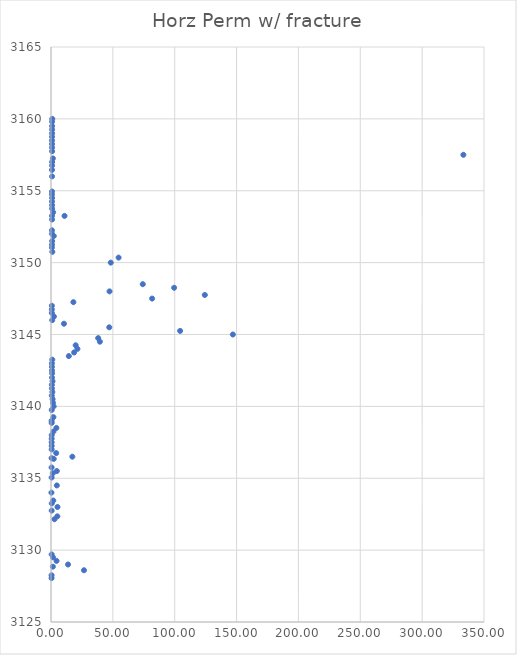
| Category | Horz Perm w/ fracture |
|---|---|
| 0.4616666666666666 | 3128.05 |
| 0.4563333333333333 | 3128.25 |
| 26.666666666666668 | 3128.6 |
| 1.5133333333333334 | 3128.85 |
| 13.766666666666666 | 3129 |
| 4.466666666666666 | 3129.25 |
| 1.62 | 3129.5 |
| 0.5323333333333333 | 3129.7 |
| 2.8000000000000003 | 3132.15 |
| 5.133333333333334 | 3132.35 |
| 0.5486666666666666 | 3132.75 |
| 5.243333333333333 | 3133 |
| 0.6086666666666667 | 3133.25 |
| 1.86 | 3133.45 |
| 0.35333333333333333 | 3134 |
| 4.706666666666667 | 3134.5 |
| 0.5143333333333334 | 3135.05 |
| 1.4633333333333332 | 3135.35 |
| 4.716666666666667 | 3135.5 |
| 0.48033333333333333 | 3135.75 |
| 2.233333333333333 | 3136.35 |
| 0.456 | 3136.4 |
| 17.266666666666666 | 3136.5 |
| 4.216666666666666 | 3136.75 |
| 0.5653333333333334 | 3137 |
| 0.5710000000000001 | 3137.25 |
| 0.5596666666666666 | 3137.5 |
| 0.5583333333333333 | 3137.75 |
| 0.5880000000000001 | 3138 |
| 1.9799999999999998 | 3138.25 |
| 4.34 | 3138.5 |
| 0.5499999999999999 | 3138.85 |
| 0.5020000000000001 | 3139 |
| 1.9633333333333336 | 3139.25 |
| 0.602 | 3139.75 |
| 2.1666666666666665 | 3140 |
| 1.5766666666666669 | 3140.25 |
| 1.2966666666666666 | 3140.5 |
| 0.641 | 3140.75 |
| 1.1066666666666667 | 3141 |
| 0.7583333333333333 | 3141.25 |
| 0.7050000000000001 | 3141.5 |
| 1.2333333333333334 | 3141.75 |
| 0.8103333333333333 | 3142 |
| 0.9003333333333333 | 3142.3 |
| 0.8116666666666666 | 3142.5 |
| 0.7483333333333334 | 3142.75 |
| 0.7356666666666666 | 3143 |
| 1.04 | 3143.25 |
| 14.4 | 3143.5 |
| 18.7 | 3143.75 |
| 21.366666666666664 | 3144 |
| 19.933333333333334 | 3144.25 |
| 39.5 | 3144.5 |
| 38.13333333333333 | 3144.75 |
| 147.0 | 3145 |
| 104.36666666666667 | 3145.25 |
| 47.1 | 3145.5 |
| 10.483333333333333 | 3145.75 |
| 0.9786666666666667 | 3146 |
| 2.3733333333333335 | 3146.25 |
| 0.6766666666666667 | 3146.5 |
| 0.6876666666666665 | 3146.75 |
| 0.6973333333333334 | 3147 |
| 18.099999999999998 | 3147.25 |
| 81.73333333333333 | 3147.5 |
| 124.33333333333333 | 3147.75 |
| 47.29999999999999 | 3148 |
| 99.53333333333335 | 3148.25 |
| 74.2 | 3148.5 |
| 48.300000000000004 | 3150 |
| 54.633333333333326 | 3150.35 |
| 1.0666666666666667 | 3150.75 |
| 0.7526666666666667 | 3151.05 |
| 0.8096666666666666 | 3151.25 |
| 0.9346666666666668 | 3151.5 |
| 2.2433333333333336 | 3151.85 |
| 0.8223333333333334 | 3152 |
| 0.7763333333333334 | 3152.25 |
| 0.8450000000000001 | 3153 |
| 0.8253333333333334 | 3153.25 |
| 10.933333333333332 | 3153.25 |
| 1.7300000000000002 | 3153.5 |
| 0.8886666666666666 | 3153.75 |
| 0.887 | 3154 |
| 0.8043333333333335 | 3154.25 |
| 0.907 | 3154.5 |
| 0.7840000000000001 | 3154.75 |
| 0.7823333333333333 | 3154.95 |
| 0.839 | 3156 |
| 0.8033333333333333 | 3156.45 |
| 0.856 | 3156.75 |
| 0.8966666666666666 | 3157 |
| 1.51 | 3157.25 |
| 333.3333333333333 | 3157.5 |
| 0.8693333333333334 | 3157.75 |
| 0.8496666666666667 | 3158 |
| 0.8066666666666666 | 3158.25 |
| 0.794 | 3158.5 |
| 0.835 | 3158.75 |
| 0.8786666666666667 | 3159 |
| 0.8906666666666667 | 3159.25 |
| 0.9013333333333332 | 3159.5 |
| 0.878 | 3159.8 |
| 1.0143333333333333 | 3160 |